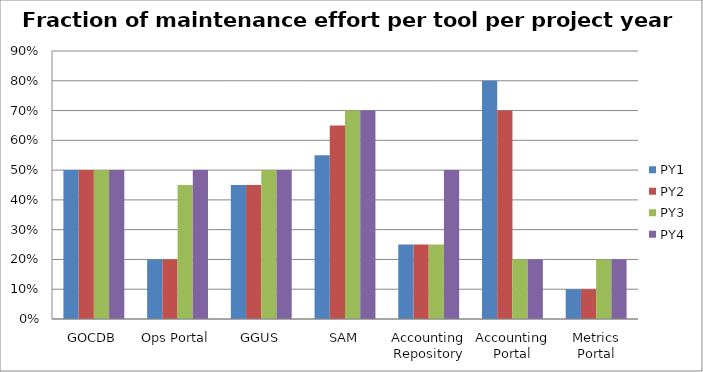
| Category | PY1 | PY2 | PY3 | PY4 |
|---|---|---|---|---|
| GOCDB | 0.5 | 0.5 | 0.5 | 0.5 |
| Ops Portal | 0.2 | 0.2 | 0.45 | 0.5 |
| GGUS | 0.45 | 0.45 | 0.5 | 0.5 |
| SAM | 0.55 | 0.65 | 0.7 | 0.7 |
| Accounting Repository | 0.25 | 0.25 | 0.25 | 0.5 |
| Accounting Portal | 0.8 | 0.7 | 0.2 | 0.2 |
| Metrics Portal | 0.1 | 0.1 | 0.2 | 0.2 |